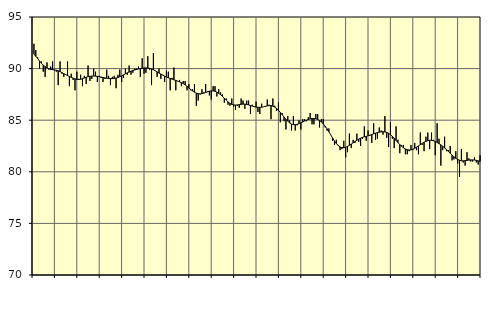
| Category | Piggar | Series 1 |
|---|---|---|
| nan | 92.4 | 91.41 |
| 1.0 | 91.8 | 91.18 |
| 1.0 | 91.1 | 90.98 |
| 1.0 | 90 | 90.73 |
| 1.0 | 90.7 | 90.52 |
| 1.0 | 89.7 | 90.33 |
| 1.0 | 89.2 | 90.19 |
| 1.0 | 90.6 | 90.08 |
| 1.0 | 89.9 | 89.99 |
| 1.0 | 90.2 | 89.93 |
| 1.0 | 90.7 | 89.9 |
| 1.0 | 89.9 | 89.87 |
| nan | 89.7 | 89.84 |
| 2.0 | 88.4 | 89.79 |
| 2.0 | 90.7 | 89.71 |
| 2.0 | 89.5 | 89.61 |
| 2.0 | 89.2 | 89.51 |
| 2.0 | 89.4 | 89.42 |
| 2.0 | 90.7 | 89.32 |
| 2.0 | 88.3 | 89.23 |
| 2.0 | 89.5 | 89.15 |
| 2.0 | 88.9 | 89.07 |
| 2.0 | 87.9 | 89 |
| 2.0 | 89.7 | 88.96 |
| nan | 89 | 88.94 |
| 3.0 | 89.4 | 88.97 |
| 3.0 | 88.3 | 89.02 |
| 3.0 | 89.3 | 89.09 |
| 3.0 | 88.5 | 89.16 |
| 3.0 | 90.3 | 89.22 |
| 3.0 | 88.8 | 89.25 |
| 3.0 | 89 | 89.27 |
| 3.0 | 90 | 89.28 |
| 3.0 | 89.7 | 89.27 |
| 3.0 | 88.7 | 89.25 |
| 3.0 | 89.3 | 89.22 |
| nan | 89.1 | 89.18 |
| 4.0 | 88.7 | 89.14 |
| 4.0 | 89 | 89.1 |
| 4.0 | 89.9 | 89.07 |
| 4.0 | 89.3 | 89.04 |
| 4.0 | 88.4 | 89.03 |
| 4.0 | 89.2 | 89.03 |
| 4.0 | 89.3 | 89.05 |
| 4.0 | 88.1 | 89.09 |
| 4.0 | 89.4 | 89.14 |
| 4.0 | 89.9 | 89.21 |
| 4.0 | 88.7 | 89.29 |
| nan | 89.1 | 89.39 |
| 5.0 | 90 | 89.49 |
| 5.0 | 89.4 | 89.59 |
| 5.0 | 90.3 | 89.67 |
| 5.0 | 89.4 | 89.75 |
| 5.0 | 89.6 | 89.82 |
| 5.0 | 90 | 89.87 |
| 5.0 | 90 | 89.92 |
| 5.0 | 90.2 | 89.96 |
| 5.0 | 89.2 | 90 |
| 5.0 | 91 | 90.03 |
| 5.0 | 89.5 | 90.06 |
| nan | 89.6 | 90.07 |
| 6.0 | 91.2 | 90.05 |
| 6.0 | 89.9 | 90.02 |
| 6.0 | 88.4 | 89.96 |
| 6.0 | 91.5 | 89.88 |
| 6.0 | 89.8 | 89.79 |
| 6.0 | 89.2 | 89.68 |
| 6.0 | 90 | 89.57 |
| 6.0 | 89 | 89.47 |
| 6.0 | 89.4 | 89.37 |
| 6.0 | 88.7 | 89.27 |
| 6.0 | 89.8 | 89.19 |
| nan | 89.7 | 89.11 |
| 7.0 | 87.9 | 89.04 |
| 7.0 | 89.1 | 88.98 |
| 7.0 | 90.1 | 88.91 |
| 7.0 | 87.9 | 88.85 |
| 7.0 | 88.8 | 88.79 |
| 7.0 | 88.9 | 88.72 |
| 7.0 | 88.3 | 88.64 |
| 7.0 | 88.8 | 88.55 |
| 7.0 | 88.8 | 88.42 |
| 7.0 | 87.9 | 88.28 |
| 7.0 | 88.5 | 88.12 |
| nan | 87.9 | 87.97 |
| 8.0 | 88 | 87.83 |
| 8.0 | 88.5 | 87.71 |
| 8.0 | 86.4 | 87.62 |
| 8.0 | 86.9 | 87.57 |
| 8.0 | 87.5 | 87.55 |
| 8.0 | 88 | 87.57 |
| 8.0 | 87.7 | 87.62 |
| 8.0 | 88.5 | 87.68 |
| 8.0 | 87.8 | 87.75 |
| 8.0 | 87.4 | 87.81 |
| 8.0 | 87 | 87.84 |
| nan | 88.3 | 87.84 |
| 9.0 | 88.3 | 87.8 |
| 9.0 | 87.3 | 87.72 |
| 9.0 | 88 | 87.6 |
| 9.0 | 87.7 | 87.47 |
| 9.0 | 87.5 | 87.31 |
| 9.0 | 86.7 | 87.13 |
| 9.0 | 87.1 | 86.95 |
| 9.0 | 86.5 | 86.77 |
| 9.0 | 86.4 | 86.63 |
| 9.0 | 87.1 | 86.53 |
| 9.0 | 86.3 | 86.48 |
| nan | 86 | 86.47 |
| 10.0 | 86.4 | 86.48 |
| 10.0 | 86.2 | 86.51 |
| 10.0 | 87.1 | 86.54 |
| 10.0 | 86.9 | 86.56 |
| 10.0 | 86.1 | 86.56 |
| 10.0 | 86.9 | 86.53 |
| 10.0 | 86.9 | 86.48 |
| 10.0 | 85.6 | 86.42 |
| 10.0 | 86.5 | 86.36 |
| 10.0 | 86.3 | 86.31 |
| 10.0 | 86.8 | 86.27 |
| nan | 85.8 | 86.25 |
| 11.0 | 85.6 | 86.25 |
| 11.0 | 86.6 | 86.26 |
| 11.0 | 86.3 | 86.3 |
| 11.0 | 86.3 | 86.34 |
| 11.0 | 87 | 86.39 |
| 11.0 | 86.5 | 86.41 |
| 11.0 | 85.1 | 86.41 |
| 11.0 | 87.1 | 86.36 |
| 11.0 | 86.4 | 86.27 |
| 11.0 | 85.9 | 86.14 |
| 11.0 | 86.7 | 85.96 |
| nan | 84.8 | 85.75 |
| 12.0 | 85.7 | 85.53 |
| 12.0 | 84.9 | 85.31 |
| 12.0 | 84.1 | 85.09 |
| 12.0 | 85.4 | 84.9 |
| 12.0 | 85 | 84.74 |
| 12.0 | 84 | 84.62 |
| 12.0 | 85.4 | 84.57 |
| 12.0 | 84 | 84.57 |
| 12.0 | 84.5 | 84.6 |
| 12.0 | 85 | 84.67 |
| 12.0 | 84.1 | 84.75 |
| nan | 85.1 | 84.83 |
| 13.0 | 85.1 | 84.92 |
| 13.0 | 84.9 | 85 |
| 13.0 | 85.3 | 85.07 |
| 13.0 | 85.7 | 85.13 |
| 13.0 | 84.6 | 85.16 |
| 13.0 | 84.6 | 85.16 |
| 13.0 | 85.6 | 85.14 |
| 13.0 | 85.6 | 85.07 |
| 13.0 | 84.3 | 84.97 |
| 13.0 | 85.1 | 84.83 |
| 13.0 | 85.1 | 84.64 |
| nan | 84.3 | 84.42 |
| 14.0 | 84 | 84.17 |
| 14.0 | 84.2 | 83.88 |
| 14.0 | 83.6 | 83.58 |
| 14.0 | 83 | 83.27 |
| 14.0 | 82.6 | 82.99 |
| 14.0 | 83.1 | 82.74 |
| 14.0 | 82.6 | 82.54 |
| 14.0 | 82.1 | 82.41 |
| 14.0 | 82.2 | 82.34 |
| 14.0 | 83 | 82.33 |
| 14.0 | 81.4 | 82.38 |
| nan | 81.9 | 82.46 |
| 15.0 | 83.7 | 82.56 |
| 15.0 | 82.3 | 82.69 |
| 15.0 | 83.1 | 82.81 |
| 15.0 | 82.8 | 82.94 |
| 15.0 | 83.7 | 83.06 |
| 15.0 | 82.9 | 83.17 |
| 15.0 | 82.5 | 83.26 |
| 15.0 | 83.2 | 83.33 |
| 15.0 | 84.4 | 83.39 |
| 15.0 | 83 | 83.43 |
| 15.0 | 84 | 83.49 |
| nan | 83.5 | 83.55 |
| 16.0 | 82.8 | 83.61 |
| 16.0 | 84.7 | 83.68 |
| 16.0 | 83.1 | 83.74 |
| 16.0 | 83.2 | 83.8 |
| 16.0 | 84.3 | 83.84 |
| 16.0 | 84 | 83.87 |
| 16.0 | 83.6 | 83.88 |
| 16.0 | 85.4 | 83.86 |
| 16.0 | 83.3 | 83.81 |
| 16.0 | 82.4 | 83.73 |
| 16.0 | 84.8 | 83.6 |
| nan | 83.2 | 83.44 |
| 17.0 | 82.3 | 83.25 |
| 17.0 | 84.4 | 83.04 |
| 17.0 | 83.1 | 82.83 |
| 17.0 | 81.8 | 82.64 |
| 17.0 | 82.6 | 82.46 |
| 17.0 | 82.6 | 82.32 |
| 17.0 | 81.7 | 82.21 |
| 17.0 | 81.7 | 82.14 |
| 17.0 | 82 | 82.11 |
| 17.0 | 82.6 | 82.13 |
| 17.0 | 82.1 | 82.19 |
| nan | 82.8 | 82.28 |
| 18.0 | 82.1 | 82.39 |
| 18.0 | 81.7 | 82.51 |
| 18.0 | 83.8 | 82.63 |
| 18.0 | 82.6 | 82.75 |
| 18.0 | 82 | 82.87 |
| 18.0 | 83.4 | 82.96 |
| 18.0 | 83.8 | 83.02 |
| 18.0 | 82.2 | 83.06 |
| 18.0 | 83.8 | 83.05 |
| 18.0 | 83.1 | 83.01 |
| 18.0 | 81.6 | 82.94 |
| nan | 84.7 | 82.84 |
| 19.0 | 83.2 | 82.73 |
| 19.0 | 80.6 | 82.61 |
| 19.0 | 82.1 | 82.47 |
| 19.0 | 83.4 | 82.32 |
| 19.0 | 82 | 82.16 |
| 19.0 | 82.1 | 81.98 |
| 19.0 | 82.5 | 81.8 |
| 19.0 | 81.1 | 81.62 |
| 19.0 | 81.2 | 81.45 |
| 19.0 | 82 | 81.31 |
| 19.0 | 80.8 | 81.2 |
| nan | 79.5 | 81.12 |
| 20.0 | 82.2 | 81.07 |
| 20.0 | 80.9 | 81.06 |
| 20.0 | 80.6 | 81.08 |
| 20.0 | 81.9 | 81.11 |
| 20.0 | 81.3 | 81.13 |
| 20.0 | 81 | 81.15 |
| 20.0 | 81 | 81.15 |
| 20.0 | 81.4 | 81.14 |
| 20.0 | 80.9 | 81.11 |
| 20.0 | 80.7 | 81.06 |
| 20.0 | 81.6 | 81.01 |